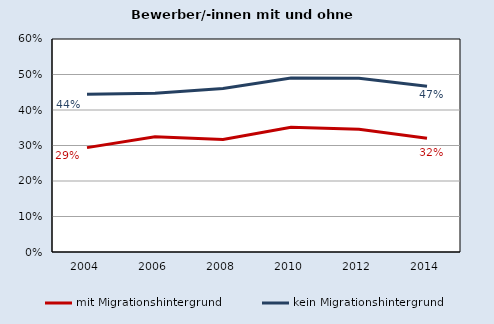
| Category | mit Migrationshintergrund | kein Migrationshintergrund |
|---|---|---|
| 2004.0 | 0.294 | 0.445 |
| 2006.0 | 0.324 | 0.447 |
| 2008.0 | 0.317 | 0.46 |
| 2010.0 | 0.352 | 0.49 |
| 2012.0 | 0.346 | 0.489 |
| 2014.0 | 0.32 | 0.467 |